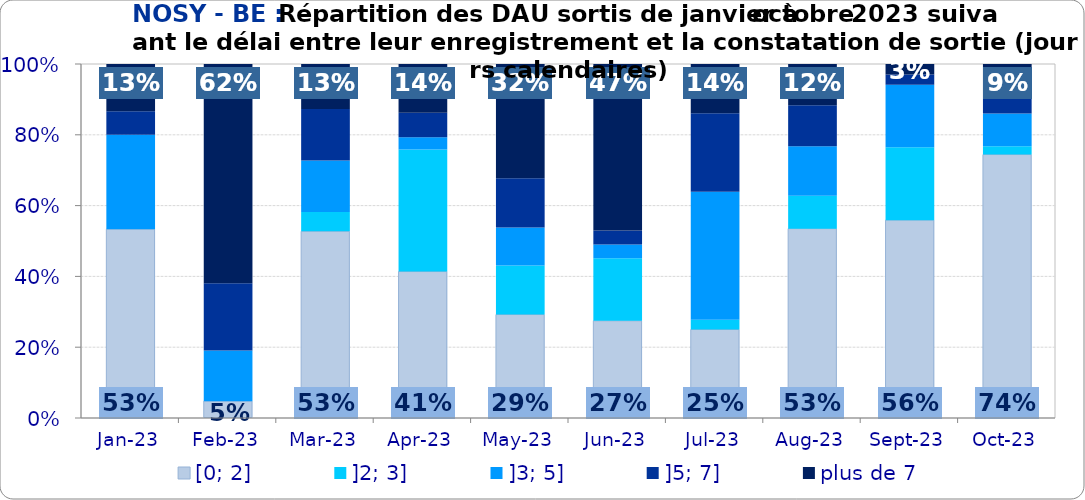
| Category | [0; 2] | ]2; 3] | ]3; 5] | ]5; 7] | plus de 7 |
|---|---|---|---|---|---|
| 2023-01-01 | 0.533 | 0 | 0.267 | 0.067 | 0.133 |
| 2023-02-01 | 0.048 | 0 | 0.143 | 0.19 | 0.619 |
| 2023-03-01 | 0.527 | 0.055 | 0.145 | 0.145 | 0.127 |
| 2023-04-01 | 0.414 | 0.345 | 0.034 | 0.069 | 0.138 |
| 2023-05-01 | 0.292 | 0.138 | 0.108 | 0.138 | 0.323 |
| 2023-06-01 | 0.275 | 0.176 | 0.039 | 0.039 | 0.471 |
| 2023-07-01 | 0.25 | 0.028 | 0.361 | 0.222 | 0.139 |
| 2023-08-01 | 0.535 | 0.093 | 0.14 | 0.116 | 0.116 |
| 2023-09-01 | 0.559 | 0.206 | 0.176 | 0.029 | 0.029 |
| 2023-10-01 | 0.744 | 0.023 | 0.093 | 0.047 | 0.093 |